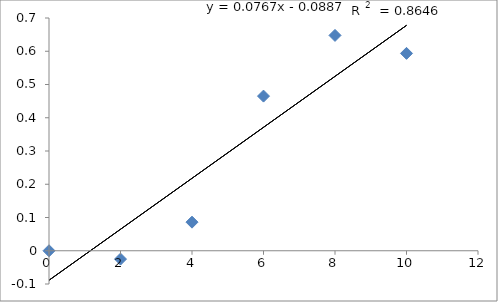
| Category | Series 0 |
|---|---|
| 0.0 | 0 |
| 2.0 | -0.025 |
| 4.0 | 0.086 |
| 6.0 | 0.465 |
| 8.0 | 0.648 |
| 10.0 | 0.594 |